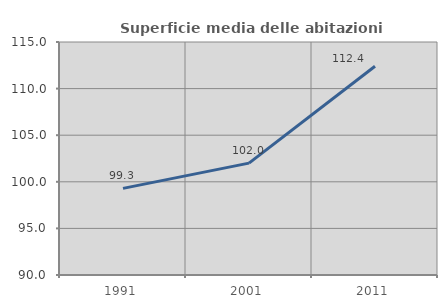
| Category | Superficie media delle abitazioni occupate |
|---|---|
| 1991.0 | 99.293 |
| 2001.0 | 102.004 |
| 2011.0 | 112.399 |